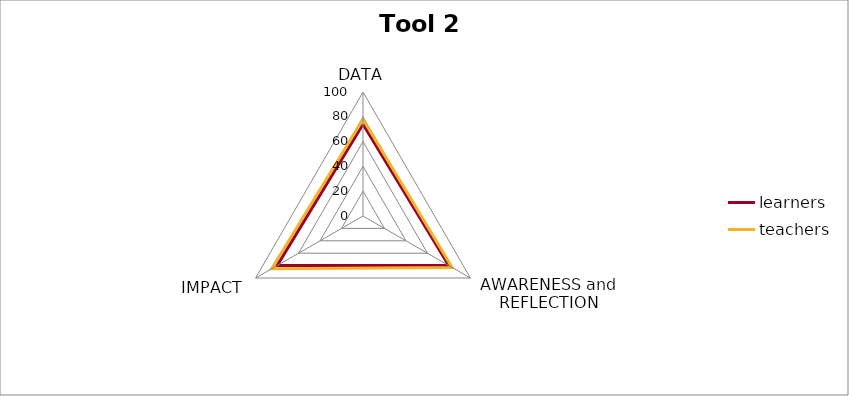
| Category | learners | teachers |
|---|---|---|
| DATA | 74 | 78 |
| AWARENESS and REFLECTION | 80 | 83 |
| IMPACT | 80 | 85 |